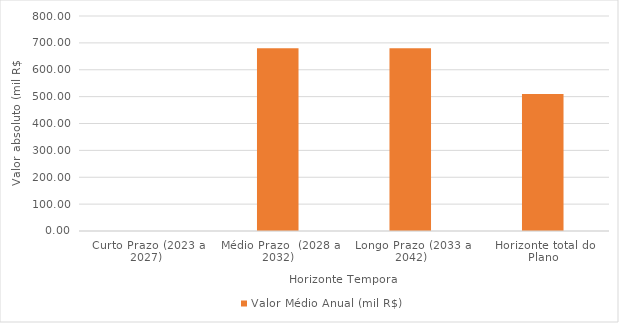
| Category | Valor Médio Anual (mil R$) |
|---|---|
| Curto Prazo (2023 a 2027) | 0 |
| Médio Prazo  (2028 a 2032) | 680 |
| Longo Prazo (2033 a 2042) | 680 |
| Horizonte total do Plano | 510 |